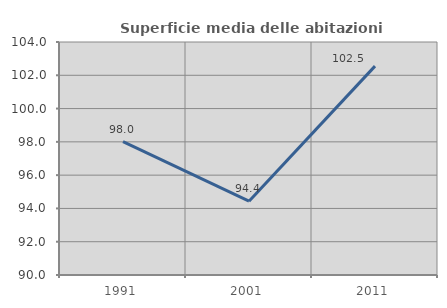
| Category | Superficie media delle abitazioni occupate |
|---|---|
| 1991.0 | 98.019 |
| 2001.0 | 94.433 |
| 2011.0 | 102.549 |